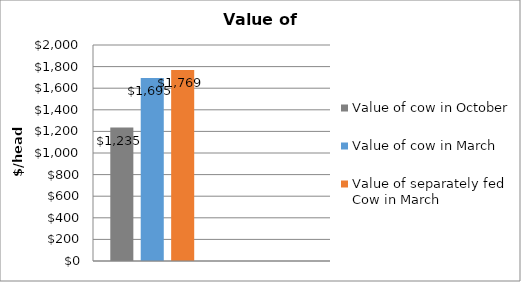
| Category | Value of cow in October | Value of cow in March | Value of separately fed Cow in March |
|---|---|---|---|
|  | 1235.136 | 1695.044 | 1769.129 |